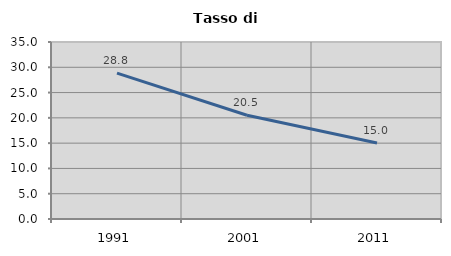
| Category | Tasso di disoccupazione   |
|---|---|
| 1991.0 | 28.834 |
| 2001.0 | 20.522 |
| 2011.0 | 15.018 |